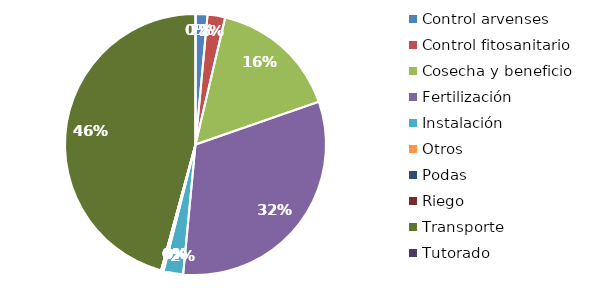
| Category | Valor |
|---|---|
| Control arvenses | 1295192 |
| Control fitosanitario | 1911797 |
| Cosecha y beneficio | 14065474.766 |
| Fertilización | 27923980.277 |
| Instalación | 2126050.609 |
| Otros | 270490 |
| Podas | 0 |
| Riego | 0 |
| Transporte | 40151148 |
| Tutorado | 0 |